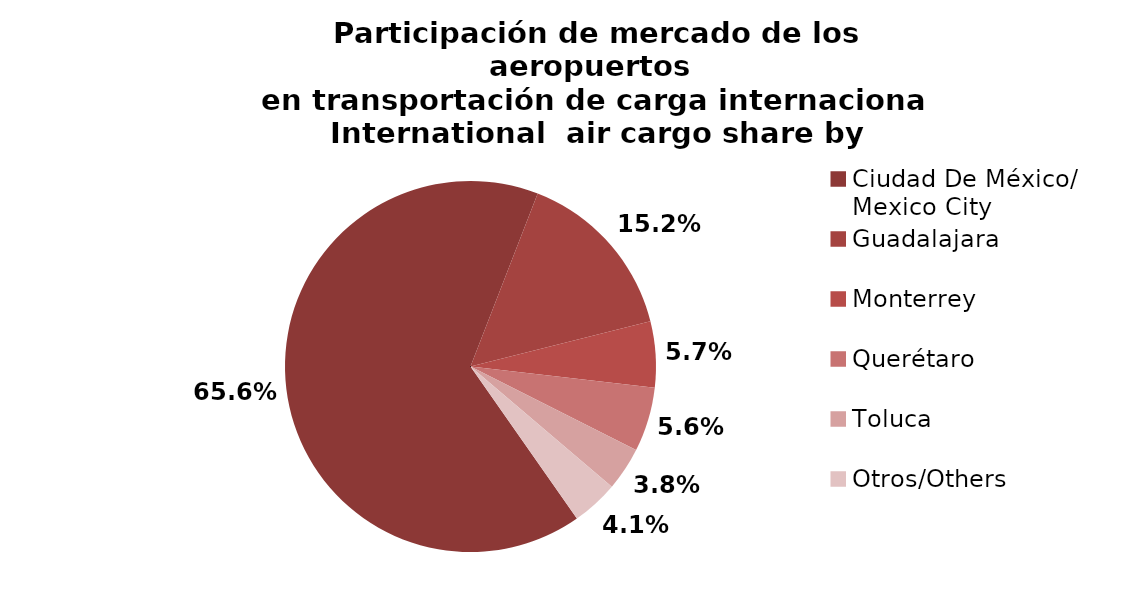
| Category | Series 0 |
|---|---|
| Ciudad De México/
Mexico City | 39634.35 |
| Guadalajara | 9170.488 |
| Monterrey | 3469.446 |
| Querétaro | 3391.086 |
| Toluca | 2277.742 |
| Otros/Others | 2454.918 |